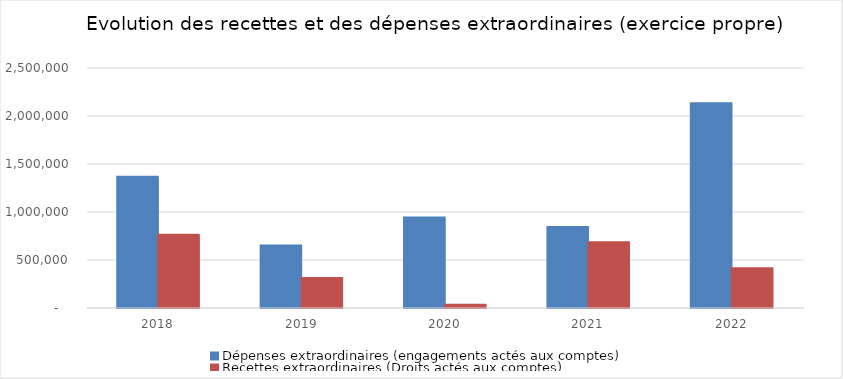
| Category | Dépenses extraordinaires (engagements actés aux comptes) | Recettes extraordinaires (Droits actés aux comptes) |
|---|---|---|
| 2018.0 | 1361140.77 | 757335 |
| 2019.0 | 646235.34 | 305993.94 |
| 2020.0 | 936814.61 | 29717.65 |
| 2021.0 | 837599.71 | 679785.14 |
| 2022.0 | 2128803.37 | 408208.57 |